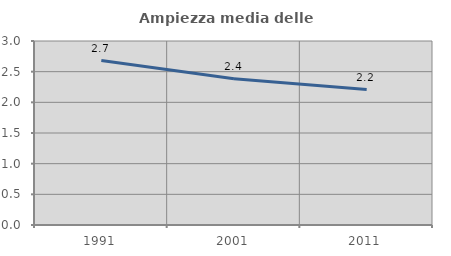
| Category | Ampiezza media delle famiglie |
|---|---|
| 1991.0 | 2.681 |
| 2001.0 | 2.384 |
| 2011.0 | 2.208 |